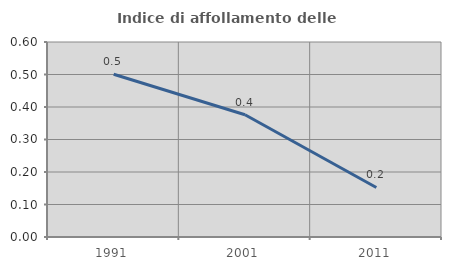
| Category | Indice di affollamento delle abitazioni  |
|---|---|
| 1991.0 | 0.501 |
| 2001.0 | 0.376 |
| 2011.0 | 0.152 |